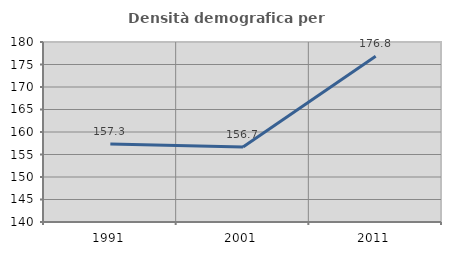
| Category | Densità demografica |
|---|---|
| 1991.0 | 157.311 |
| 2001.0 | 156.692 |
| 2011.0 | 176.849 |